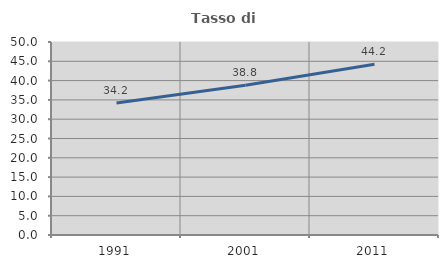
| Category | Tasso di occupazione   |
|---|---|
| 1991.0 | 34.2 |
| 2001.0 | 38.787 |
| 2011.0 | 44.211 |